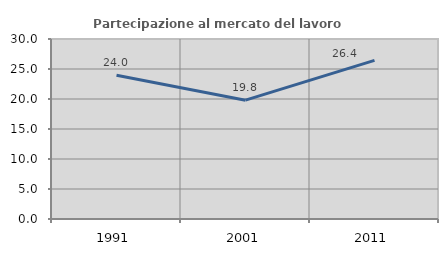
| Category | Partecipazione al mercato del lavoro  femminile |
|---|---|
| 1991.0 | 23.967 |
| 2001.0 | 19.802 |
| 2011.0 | 26.437 |